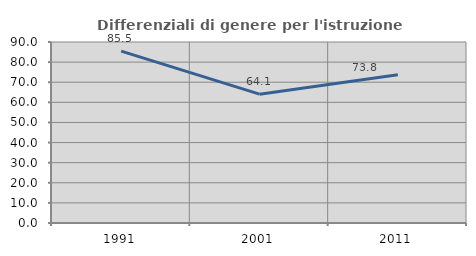
| Category | Differenziali di genere per l'istruzione superiore |
|---|---|
| 1991.0 | 85.494 |
| 2001.0 | 64.068 |
| 2011.0 | 73.764 |